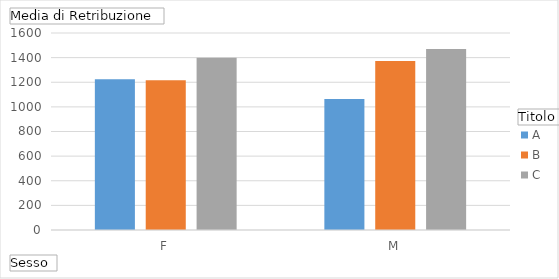
| Category | A | B | C |
|---|---|---|---|
| F | 1223.486 | 1216.531 | 1399.303 |
| M | 1064.418 | 1373.235 | 1469.898 |